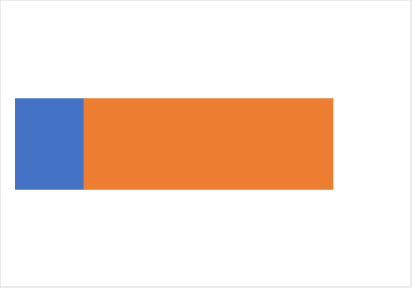
| Category | Так | Ні  |
|---|---|---|
| 0 | 0.216 | 0.784 |